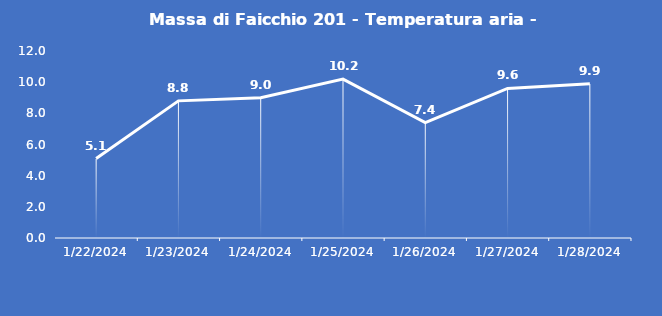
| Category | Massa di Faicchio 201 - Temperatura aria - Grezzo (°C) |
|---|---|
| 1/22/24 | 5.1 |
| 1/23/24 | 8.8 |
| 1/24/24 | 9 |
| 1/25/24 | 10.2 |
| 1/26/24 | 7.4 |
| 1/27/24 | 9.6 |
| 1/28/24 | 9.9 |